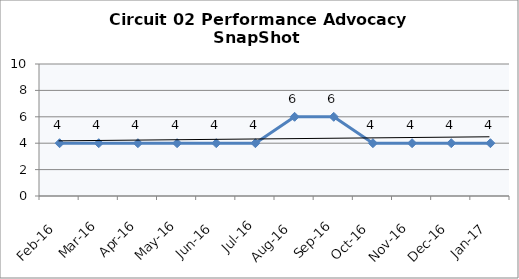
| Category | Circuit 02 |
|---|---|
| Feb-16 | 4 |
| Mar-16 | 4 |
| Apr-16 | 4 |
| May-16 | 4 |
| Jun-16 | 4 |
| Jul-16 | 4 |
| Aug-16 | 6 |
| Sep-16 | 6 |
| Oct-16 | 4 |
| Nov-16 | 4 |
| Dec-16 | 4 |
| Jan-17 | 4 |